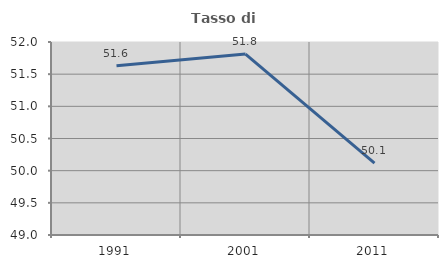
| Category | Tasso di occupazione   |
|---|---|
| 1991.0 | 51.629 |
| 2001.0 | 51.812 |
| 2011.0 | 50.117 |